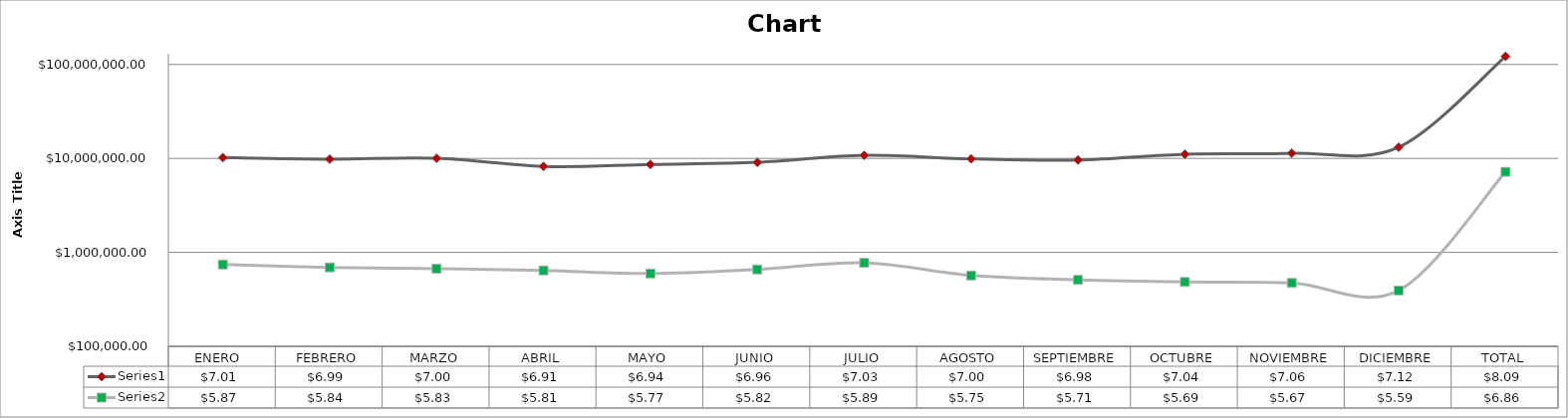
| Category | Series 0 | Series 1 |
|---|---|---|
| ENERO  | 10199879.49 | 742534.75 |
| FEBRERO | 9816926.29 | 692167.8 |
| MARZO | 10034405.6 | 669708.75 |
| ABRIL | 8216446.92 | 642476.75 |
| MAYO | 8633714.53 | 595428.75 |
| JUNIO | 9081841.85 | 658033 |
| JULIO | 10782794.18 | 775018.75 |
| AGOSTO | 9893149.57 | 567434.75 |
| SEPTIEMBRE | 9617727.8 | 509846.25 |
| OCTUBRE | 11091575.84 | 484332.5 |
| NOVIEMBRE | 11356864.21 | 473056.25 |
| DICIEMBRE | 13159002.35 | 392817.5 |
| TOTAL | 121884328.63 | 7202855.8 |